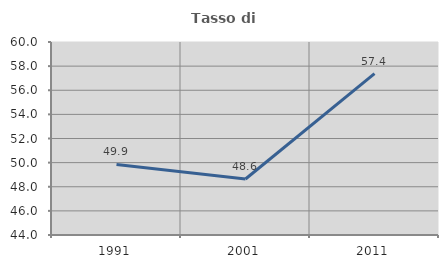
| Category | Tasso di occupazione   |
|---|---|
| 1991.0 | 49.853 |
| 2001.0 | 48.641 |
| 2011.0 | 57.385 |